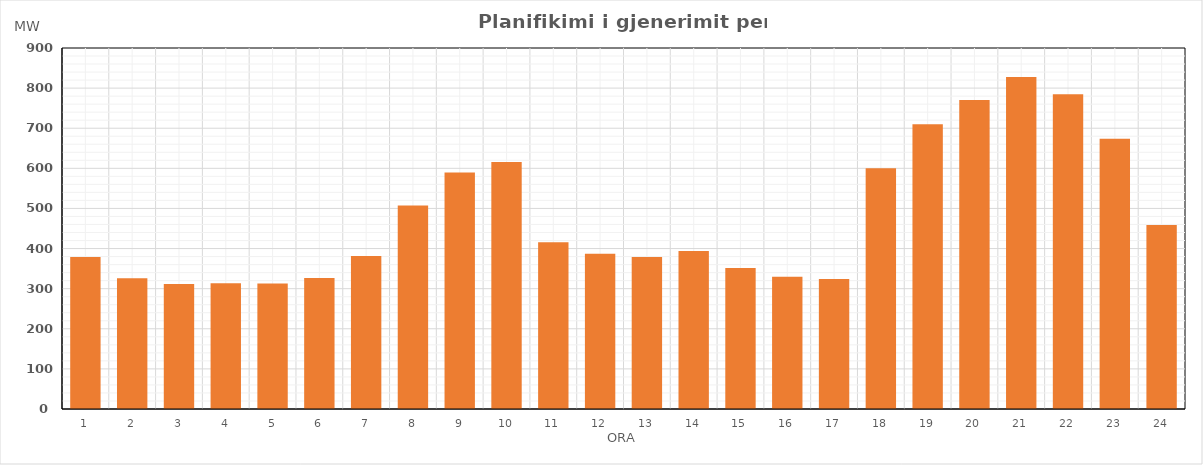
| Category | Max (MW) |
|---|---|
| 0 | 378.7 |
| 1 | 325.74 |
| 2 | 311.74 |
| 3 | 313.75 |
| 4 | 312.7 |
| 5 | 326.55 |
| 6 | 381.51 |
| 7 | 507.52 |
| 8 | 589.58 |
| 9 | 615.76 |
| 10 | 415.74 |
| 11 | 386.76 |
| 12 | 378.71 |
| 13 | 393.76 |
| 14 | 351.57 |
| 15 | 329.57 |
| 16 | 324.08 |
| 17 | 600.08 |
| 18 | 710.18 |
| 19 | 770.2 |
| 20 | 827.61 |
| 21 | 784.65 |
| 22 | 673.55 |
| 23 | 458.61 |